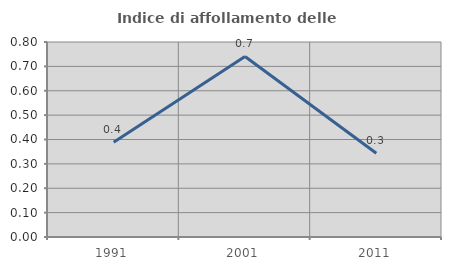
| Category | Indice di affollamento delle abitazioni  |
|---|---|
| 1991.0 | 0.388 |
| 2001.0 | 0.741 |
| 2011.0 | 0.344 |